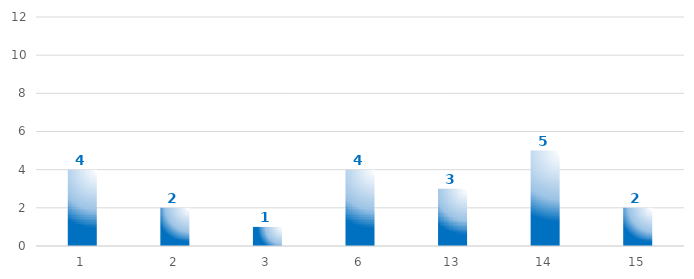
| Category | Iniciativas |
|---|---|
| 1.0 | 4 |
| 2.0 | 2 |
| 3.0 | 1 |
| 6.0 | 4 |
| 13.0 | 3 |
| 14.0 | 5 |
| 15.0 | 2 |